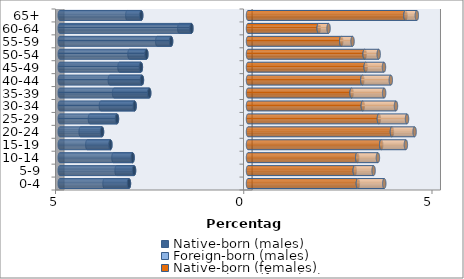
| Category | Native-born (males) | Foreign-born (males) | Native-born (females) | Foreign-born (females) |
|---|---|---|---|---|
| 0-4 | -3.162 | -0.649 | 2.919 | 0.701 |
| 5-9 | -3.027 | -0.463 | 2.835 | 0.501 |
| 10-14 | -3.065 | -0.509 | 2.902 | 0.549 |
| 15-19 | -3.655 | -0.614 | 3.539 | 0.655 |
| 20-24 | -3.878 | -0.568 | 3.823 | 0.602 |
| 25-29 | -3.48 | -0.718 | 3.477 | 0.746 |
| 30-34 | -3.012 | -0.895 | 3.05 | 0.881 |
| 35-39 | -2.624 | -0.933 | 2.752 | 0.864 |
| 40-44 | -2.817 | -0.854 | 3.037 | 0.756 |
| 45-49 | -2.845 | -0.569 | 3.126 | 0.485 |
| 50-54 | -2.699 | -0.449 | 3.099 | 0.373 |
| 55-59 | -2.043 | -0.367 | 2.477 | 0.3 |
| 60-64 | -1.504 | -0.322 | 1.879 | 0.262 |
| 65+ | -2.836 | -0.369 | 4.183 | 0.302 |